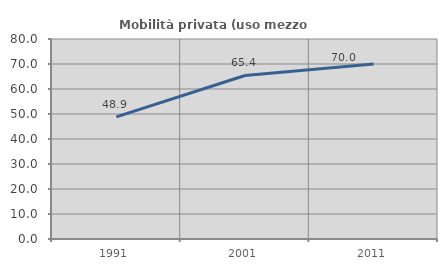
| Category | Mobilità privata (uso mezzo privato) |
|---|---|
| 1991.0 | 48.86 |
| 2001.0 | 65.411 |
| 2011.0 | 70 |